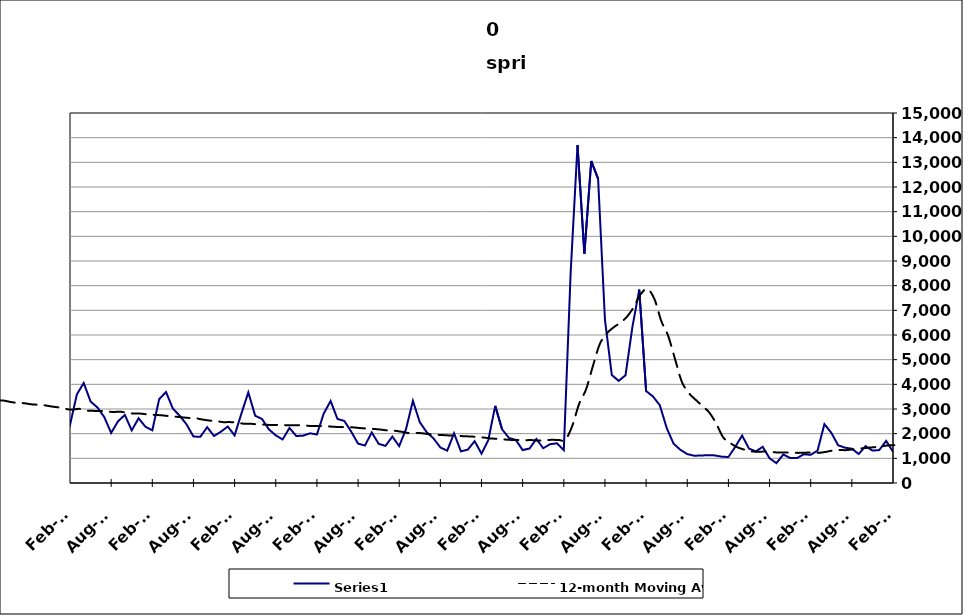
| Category | Series 0 |
|---|---|
| 2005-05-31 | 3131 |
| 2005-06-30 | 2953 |
| 2005-07-31 | 2452 |
| 2005-08-31 | 1842 |
| 2005-09-30 | 1444 |
| 2005-10-31 | 2141 |
| 2005-11-30 | 1626 |
| 2005-12-31 | 1998 |
| 2006-01-31 | 1588 |
| 2006-02-28 | 1445 |
| 2006-03-31 | 1949 |
| 2006-04-30 | 2959 |
| 2006-05-31 | 2381 |
| 2006-06-30 | 2220 |
| 2006-07-31 | 2123 |
| 2006-08-31 | 1525 |
| 2006-09-30 | 1615 |
| 2006-10-31 | 1860 |
| 2006-11-30 | 1507 |
| 2006-12-31 | 1965 |
| 2007-01-31 | 2023 |
| 2007-02-28 | 1616 |
| 2007-03-31 | 2671 |
| 2007-04-30 | 3721 |
| 2007-05-31 | 2286 |
| 2007-06-30 | 3372 |
| 2007-07-30 | 2459 |
| 2007-08-31 | 1980 |
| 2007-09-30 | 2331 |
| 2007-10-31 | 2490 |
| 2007-11-15 | 1970 |
| 2007-12-15 09:36:00 | 2318 |
| 2008-01-14 19:12:00 | 2557 |
| 2008-02-14 04:48:00 | 2676 |
| 2008-03-15 14:24:00 | 3345 |
| 2008-04-15 | 4771 |
| 2008-05-15 09:36:00 | 3529 |
| 2008-06-14 19:12:00 | 4044 |
| 2008-07-15 04:48:00 | 3468 |
| 2008-08-14 14:24:00 | 2936 |
| 2008-09-14 | 3327 |
| 2008-10-14 09:36:00 | 4398 |
| 2008-11-13 19:12:00 | 4288 |
| 2008-12-14 04:48:00 | 4919 |
| 2009-01-13 14:24:00 | 4529 |
| 2009-02-13 | 4588 |
| 2009-03-15 09:36:00 | 6230 |
| 2009-04-14 19:12:00 | 6528 |
| 2009-05-15 04:48:00 | 5710 |
| 2009-06-14 14:24:00 | 5729 |
| 2009-07-15 | 5181 |
| 2009-08-14 09:36:00 | 4471 |
| 2009-09-13 19:12:00 | 4514 |
| 2009-10-14 04:48:00 | 4928 |
| 2009-11-13 14:24:00 | 4288 |
| 2009-12-14 | 4919 |
| 2010-01-13 09:36:00 | 4406 |
| 2010-02-12 19:12:00 | 3451 |
| 2010-03-15 04:48:00 | 4910 |
| 2010-04-14 14:24:00 | 5413 |
| 2010-05-15 | 4664 |
| 2010-06-14 09:36:00 | 4652 |
| 2010-07-14 19:12:00 | 3833 |
| 2010-08-14 04:48:00 | 3333 |
| 2010-09-13 14:24:00 | 3073 |
| 2010-10-14 | 3708 |
| 2010-11-13 09:36:00 | 3510 |
| 2010-12-13 19:12:00 | 3680 |
| 2011-01-13 04:48:00 | 3314 |
| 2011-02-12 14:24:00 | 2671 |
| 2011-03-15 | 4059 |
| 2011-04-14 09:36:00 | 4574 |
| 2011-05-14 19:12:00 | 4200 |
| 2011-06-14 04:48:00 | 4010 |
| 2011-07-14 14:24:00 | 3058 |
| 2011-08-14 | 3003 |
| 2011-09-13 09:36:00 | 2938 |
| 2011-10-13 19:12:00 | 3534 |
| 2011-11-13 04:48:00 | 3132 |
| 2011-12-13 14:24:00 | 3706 |
| 2012-01-13 | 3182 |
| 2012-02-12 09:36:00 | 2802 |
| 2012-03-13 19:12:00 | 3584 |
| 2012-04-13 04:48:00 | 4909 |
| 2012-05-13 14:24:00 | 4188 |
| 2012-06-13 | 3531 |
| 2012-07-13 09:36:00 | 3044 |
| 2012-08-12 19:12:00 | 2885 |
| 2012-09-12 04:48:00 | 2556 |
| 2012-10-12 14:24:00 | 3582 |
| 2012-11-12 | 3054 |
| 2012-12-12 09:36:00 | 3117 |
| 2013-01-11 19:12:00 | 3385 |
| 2013-02-11 04:48:00 | 2732 |
| 2013-03-13 14:24:00 | 3189 |
| 2013-04-13 | 4828 |
| 2013-05-13 09:36:00 | 3513 |
| 2013-06-12 19:12:00 | 3099 |
| 2013-07-13 04:48:00 | 2867 |
| 2013-08-12 14:24:00 | 2371 |
| 2013-09-12 | 2330 |
| 2013-10-12 09:36:00 | 3301 |
| 2013-11-11 19:12:00 | 2499 |
| 2013-12-12 04:48:00 | 2658 |
| 2014-01-11 14:24:00 | 2669 |
| 2014-02-11 | 2351 |
| 2014-03-13 09:36:00 | 3592 |
| 2014-04-12 19:12:00 | 4054 |
| 2014-05-13 04:48:00 | 3305 |
| 2014-06-12 14:24:00 | 3062 |
| 2014-07-13 | 2671 |
| 2014-08-12 09:36:00 | 2031 |
| 2014-09-11 19:12:00 | 2501 |
| 2014-10-12 04:48:00 | 2759 |
| 2014-11-11 14:24:00 | 2132 |
| 2014-12-12 | 2624 |
| 2015-01-11 09:36:00 | 2280 |
| 2015-02-10 19:12:00 | 2135 |
| 2015-03-13 04:48:00 | 3396 |
| 2015-04-12 14:24:00 | 3689 |
| 2015-05-13 | 3015 |
| 2015-06-12 09:36:00 | 2729 |
| 2015-07-12 19:12:00 | 2373 |
| 2015-08-12 04:48:00 | 1884 |
| 2015-09-11 14:24:00 | 1872 |
| 2015-10-12 | 2261 |
| 2015-11-11 09:36:00 | 1906 |
| 2015-12-11 19:12:00 | 2079 |
| 2016-01-11 04:48:00 | 2289 |
| 2016-02-10 14:24:00 | 1931 |
| 2016-03-12 | 2822 |
| 2016-04-11 09:36:00 | 3674 |
| 2016-05-11 19:12:00 | 2728 |
| 2016-06-11 04:48:00 | 2594 |
| 2016-07-11 14:24:00 | 2175 |
| 2016-08-11 | 1931 |
| 2016-09-10 09:36:00 | 1765 |
| 2016-10-10 19:12:00 | 2230 |
| 2016-11-10 04:48:00 | 1905 |
| 2016-12-10 14:24:00 | 1919 |
| 2017-01-10 | 2015 |
| 2017-02-09 09:36:00 | 1968 |
| 2017-03-11 19:12:00 | 2817 |
| 2017-04-11 04:48:00 | 3325 |
| 2017-05-11 14:24:00 | 2596 |
| 2017-06-11 | 2516 |
| 2017-07-11 09:36:00 | 2084 |
| 2017-08-10 19:12:00 | 1597 |
| 2017-09-10 04:48:00 | 1518 |
| 2017-10-10 14:24:00 | 2050 |
| 2017-11-10 | 1589 |
| 2017-12-10 09:36:00 | 1505 |
| 2018-01-09 19:12:00 | 1882 |
| 2018-02-09 04:48:00 | 1495 |
| 2018-03-11 14:24:00 | 2194 |
| 2018-04-11 | 3332 |
| 2018-05-11 09:36:00 | 2466 |
| 2018-06-10 19:12:00 | 2063 |
| 2018-07-11 04:48:00 | 1809 |
| 2018-08-10 14:24:00 | 1440 |
| 2018-09-10 | 1313 |
| 2018-10-10 09:36:00 | 2015 |
| 2018-11-09 19:12:00 | 1282 |
| 2018-12-10 04:48:00 | 1351 |
| 2019-01-09 14:24:00 | 1695 |
| 2019-02-09 | 1189 |
| 2019-03-11 09:36:00 | 1746 |
| 2019-04-10 19:12:00 | 3126 |
| 2019-05-11 04:48:00 | 2174 |
| 2019-06-10 14:24:00 | 1827 |
| 2019-07-11 | 1744 |
| 2019-08-10 09:36:00 | 1335 |
| 2019-09-09 19:12:00 | 1398 |
| 2019-10-10 04:48:00 | 1790 |
| 2019-11-09 14:24:00 | 1407 |
| 2019-12-10 | 1573 |
| 2020-01-09 09:36:00 | 1610 |
| 2020-02-08 19:12:00 | 1333 |
| 2020-03-10 04:48:00 | 8532 |
| 2020-04-09 14:24:00 | 13699 |
| 2020-05-10 | 9300 |
| 2020-06-09 09:36:00 | 13055 |
| 2020-07-09 19:12:00 | 12333 |
| 2020-08-09 04:48:00 | 6620 |
| 2020-09-08 14:24:00 | 4377 |
| 2020-10-09 | 4142 |
| 2020-11-08 09:36:00 | 4370 |
| 2020-12-08 19:12:00 | 6320 |
| 2021-01-08 04:48:00 | 7842 |
| 2021-02-07 14:24:00 | 3728 |
| 2021-03-10 | 3509 |
| 2021-04-09 09:36:00 | 3153 |
| 2021-05-09 19:12:00 | 2232 |
| 2021-06-09 04:48:00 | 1596 |
| 2021-07-09 14:24:00 | 1345 |
| 2021-08-09 | 1172 |
| 2021-09-08 09:36:00 | 1107 |
| 2021-10-08 19:12:00 | 1113 |
| 2021-11-08 04:48:00 | 1129 |
| 2021-12-08 14:24:00 | 1119 |
| 2022-01-08 | 1069 |
| 2022-02-07 09:36:00 | 1053 |
| 2022-03-09 19:12:00 | 1468 |
| 2022-04-09 04:48:00 | 1924 |
| 2022-05-09 14:24:00 | 1396 |
| 2022-06-09 | 1281 |
| 2022-07-09 09:36:00 | 1468 |
| 2022-08-08 19:12:00 | 1003 |
| 2022-09-08 04:48:00 | 806 |
| 2022-10-08 14:24:00 | 1152 |
| 2022-11-08 | 1018 |
| 2022-12-08 09:36:00 | 1012 |
| 2023-01-07 19:12:00 | 1164 |
| 2023-02-07 04:48:00 | 1142 |
| 2023-03-09 14:24:00 | 1314 |
| 2023-04-09 | 2387 |
| 2023-05-09 09:36:00 | 2037 |
| 2023-06-08 19:12:00 | 1530 |
| 2023-07-09 04:48:00 | 1431 |
| 2023-08-08 14:24:00 | 1391 |
| 2023-09-08 | 1174 |
| 2023-10-08 09:36:00 | 1496 |
| 2023-11-07 19:12:00 | 1313 |
| 2023-12-08 04:48:00 | 1335 |
| 2024-01-07 14:24:00 | 1707 |
| 2024-02-07 | 1268 |